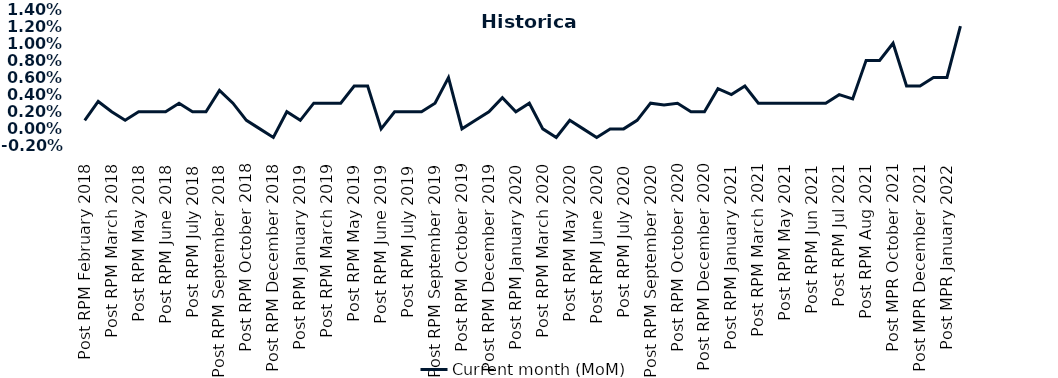
| Category | Current month (MoM)  |
|---|---|
| Post RPM February 2018 | 0.001 |
| Pre RPM March 2018 | 0.003 |
| Post RPM March 2018 | 0.002 |
| Pre RPM May 2018 | 0.001 |
| Post RPM May 2018 | 0.002 |
| Pre RPM June 2018 | 0.002 |
| Post RPM June 2018 | 0.002 |
| Pre RPM July 2018 | 0.003 |
| Post RPM July 2018 | 0.002 |
| Pre RPM September 2018 | 0.002 |
| Post RPM September 2018 | 0.004 |
| Pre RPM October 2018 | 0.003 |
| Post RPM October 2018 | 0.001 |
| Pre RPM December 2018 | 0 |
| Post RPM December 2018 | -0.001 |
| Pre RPM January 2019 | 0.002 |
| Post RPM January 2019 | 0.001 |
| Pre RPM March 2019 | 0.003 |
| Post RPM March 2019 | 0.003 |
| Pre RPM May 2019 | 0.003 |
| Post RPM May 2019 | 0.005 |
| Pre RPM June 2019 | 0.005 |
| Post RPM June 2019 | 0 |
| Pre RPM July 2019 | 0.002 |
| Post RPM July 2019 | 0.002 |
| Pre RPM September 2019 | 0.002 |
| Post RPM September 2019 | 0.003 |
| Pre RPM October 2019 | 0.006 |
| Post RPM October 2019 | 0 |
| Pre RPM December 2019 | 0.001 |
| Post RPM December 2019 | 0.002 |
| Pre RPM January 2020 | 0.004 |
| Post RPM January 2020 | 0.002 |
| Pre RPM March 2020 | 0.003 |
| Post RPM March 2020 | 0 |
| Pre RPM May 2020 | -0.001 |
| Post RPM May 2020 | 0.001 |
| Pre RPM June 2020 | 0 |
| Post RPM June 2020 | -0.001 |
| Pre RPM July 2020 | 0 |
| Post RPM July 2020 | 0 |
| Pre RPM September 2020 | 0.001 |
| Post RPM September 2020 | 0.003 |
| Pre RPM October 2020 | 0.003 |
| Post RPM October 2020 | 0.003 |
| Pre RPM December 2020 | 0.002 |
|  Post RPM December 2020 | 0.002 |
| Pre RPM January 2021 | 0.005 |
| Post RPM January 2021 | 0.004 |
|  Pre RPM March 2021 | 0.005 |
|  Post RPM March 2021 | 0.003 |
|  Pre RPM May 2021 | 0.003 |
|  Post RPM May 2021 | 0.003 |
|  Pre RPM Jun 2021 | 0.003 |
|   Post RPM Jun 2021 | 0.003 |
| Pre RPM Jul 2021 | 0.003 |
|  Post RPM Jul 2021 | 0.004 |
| Pre RPM Aug 2021 | 0.004 |
|  Post RPM Aug 2021 | 0.008 |
| Pre MPR October 2021 | 0.008 |
| Post MPR October 2021 | 0.01 |
| Pre MPR December 2021 | 0.005 |
| Post MPR December 2021 | 0.005 |
| Pre MPR January 2022 | 0.006 |
| Post MPR January 2022 | 0.006 |
| Pre MPR March 2022 | 0.012 |